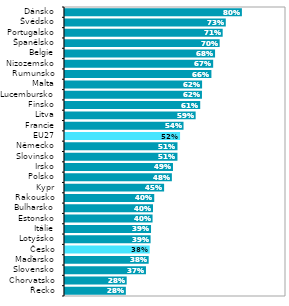
| Category | Series 1 |
|---|---|
| Řecko | 0.275 |
| Chorvatsko | 0.279 |
| Slovensko | 0.366 |
| Maďarsko | 0.379 |
| Česko | 0.383 |
| Lotyšsko | 0.387 |
| Itálie | 0.389 |
| Estonsko | 0.396 |
| Bulharsko | 0.398 |
| Rakousko | 0.404 |
| Kypr | 0.448 |
| Polsko | 0.484 |
| Irsko | 0.489 |
| Slovinsko | 0.509 |
| Německo | 0.509 |
| EU27 | 0.521 |
| Francie | 0.536 |
| Litva | 0.591 |
| Finsko | 0.612 |
| Lucembursko | 0.62 |
| Malta | 0.62 |
| Rumunsko | 0.663 |
| Nizozemsko | 0.67 |
| Belgie | 0.679 |
| Španělsko | 0.7 |
| Portugalsko | 0.714 |
| Švédsko | 0.728 |
| Dánsko | 0.8 |